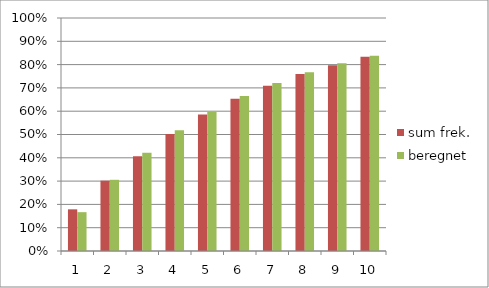
| Category | sum frek. | beregnet |
|---|---|---|
| 1.0 | 0.179 | 0.167 |
| 2.0 | 0.302 | 0.306 |
| 3.0 | 0.407 | 0.421 |
| 4.0 | 0.502 | 0.518 |
| 5.0 | 0.586 | 0.598 |
| 6.0 | 0.653 | 0.665 |
| 7.0 | 0.71 | 0.721 |
| 8.0 | 0.759 | 0.767 |
| 9.0 | 0.797 | 0.806 |
| 10.0 | 0.834 | 0.838 |